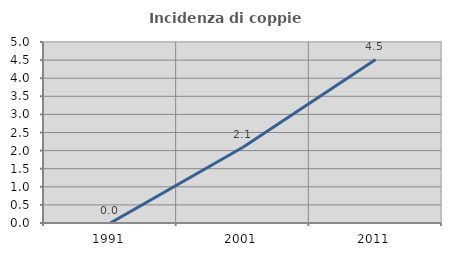
| Category | Incidenza di coppie miste |
|---|---|
| 1991.0 | 0 |
| 2001.0 | 2.094 |
| 2011.0 | 4.52 |